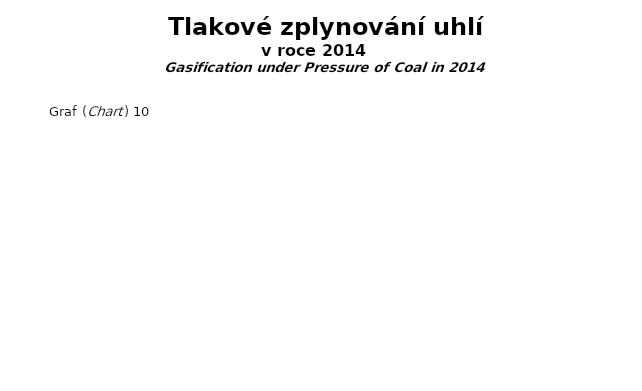
| Category | Series 0 |
|---|---|
| Prov. spotřeba (Work.Consump.) | 0 |
| Ztráty (Losses) | 0 |
| Energoplyn (Energo-gas) | 0 |
| Hnědouhelný dehet (Tars) | 0 |
| Ostatní (Others) | 0 |